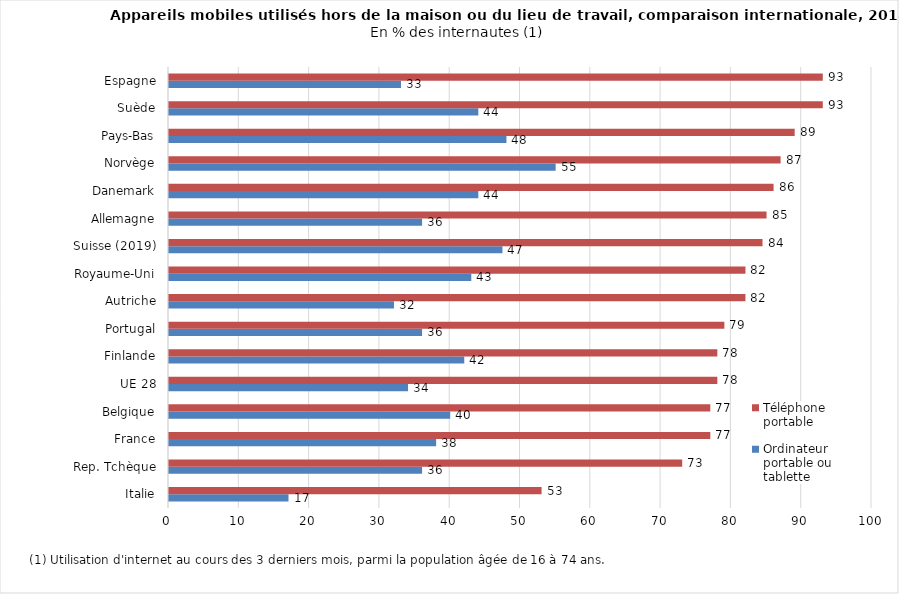
| Category | Ordinateur portable ou tablette | Téléphone portable |
|---|---|---|
| Italie | 17 | 53 |
| Rep. Tchèque | 36 | 73 |
| France | 38 | 77 |
| Belgique | 40 | 77 |
| UE 28 | 34 | 78 |
| Finlande | 42 | 78 |
| Portugal | 36 | 79 |
| Autriche | 32 | 82 |
| Royaume-Uni | 43 | 82 |
| Suisse (2019) | 47.432 | 84.427 |
| Allemagne | 36 | 85 |
| Danemark | 44 | 86 |
| Norvège | 55 | 87 |
| Pays-Bas | 48 | 89 |
| Suède | 44 | 93 |
| Espagne | 33 | 93 |